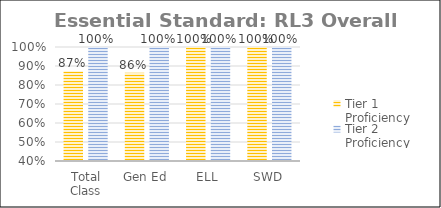
| Category | Tier 1 Proficiency | Tier 2 Proficiency |
|---|---|---|
| Total Class | 0.872 | 1 |
| Gen Ed | 0.865 | 1 |
| ELL | 1 | 1 |
| SWD | 1 | 1 |